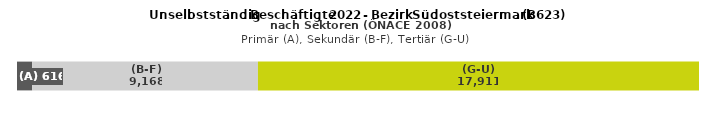
| Category | (A) | (B-F) | (G-U) |
|---|---|---|---|
| 0 | 616 | 9168 | 17911 |